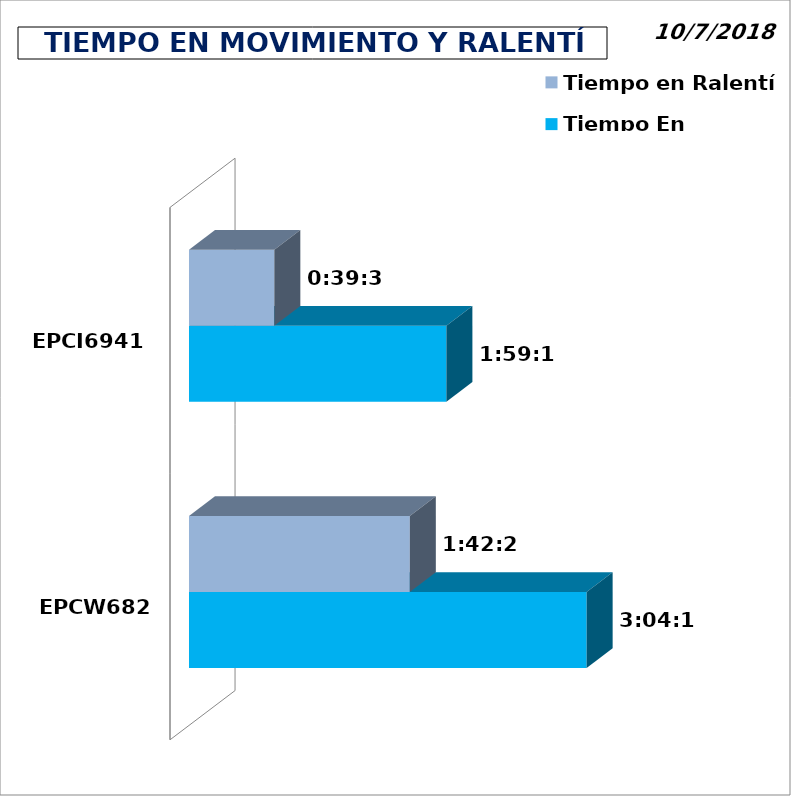
| Category | Tiempo En movimiento | Tiempo en Ralentí |
|---|---|---|
| EPCW6826 | 0.128 | 0.071 |
| EPCI6941 | 0.083 | 0.027 |